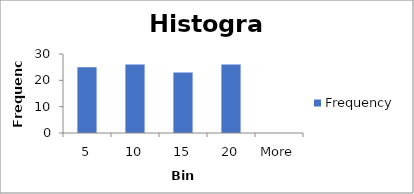
| Category | Frequency |
|---|---|
| 5 | 25 |
| 10 | 26 |
| 15 | 23 |
| 20 | 26 |
| More | 0 |